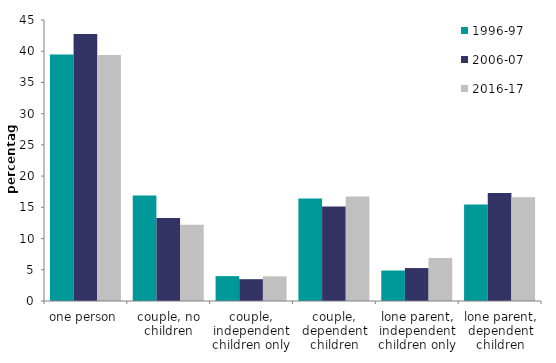
| Category | 1996-97 | 2006-07 | 2016-17 |
|---|---|---|---|
| one person | 39.471 | 42.778 | 39.402 |
| couple, no children | 16.906 | 13.289 | 12.225 |
| couple, independent children only | 3.985 | 3.493 | 3.945 |
| couple, dependent children | 16.427 | 15.126 | 16.738 |
| lone parent, independent children only | 4.881 | 5.276 | 6.889 |
| lone parent, dependent children | 15.437 | 17.302 | 16.63 |